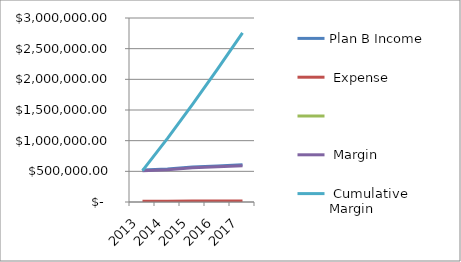
| Category | Plan B Income | Plan B Expense | Plan B Margin | Plan B Cumulative Margin |
|---|---|---|---|---|
| 2013.0 | 523716 |  | 510237 | 510237 |
| 2014.0 | 539427.48 |  | 525544.11 | 1035781.11 |
| 2015.0 | 571793.129 |  | 557493.258 | 1593274.368 |
| 2016.0 | 588946.923 |  | 574218.055 | 2167492.423 |
| 2017.0 | 606615.33 |  | 591444.597 | 2758937.02 |